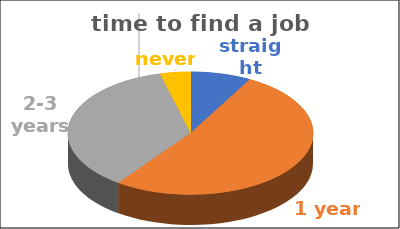
| Category | time to find a job | Series 1 | Series 2 | Series 3 | Series 4 |
|---|---|---|---|---|---|
| straight away | 0.08 |  |  |  |  |
| 1 year | 0.52 |  |  |  |  |
| 2-3 years | 0.36 |  |  |  |  |
| never | 0.04 |  |  |  |  |